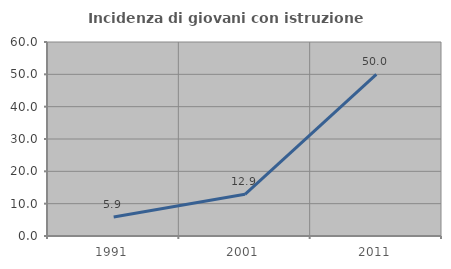
| Category | Incidenza di giovani con istruzione universitaria |
|---|---|
| 1991.0 | 5.882 |
| 2001.0 | 12.903 |
| 2011.0 | 50 |